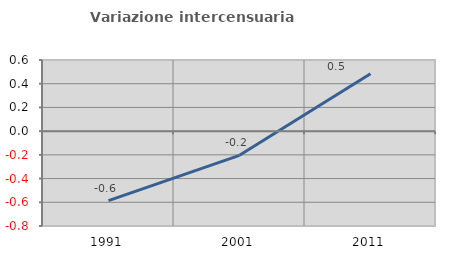
| Category | Variazione intercensuaria annua |
|---|---|
| 1991.0 | -0.587 |
| 2001.0 | -0.204 |
| 2011.0 | 0.484 |